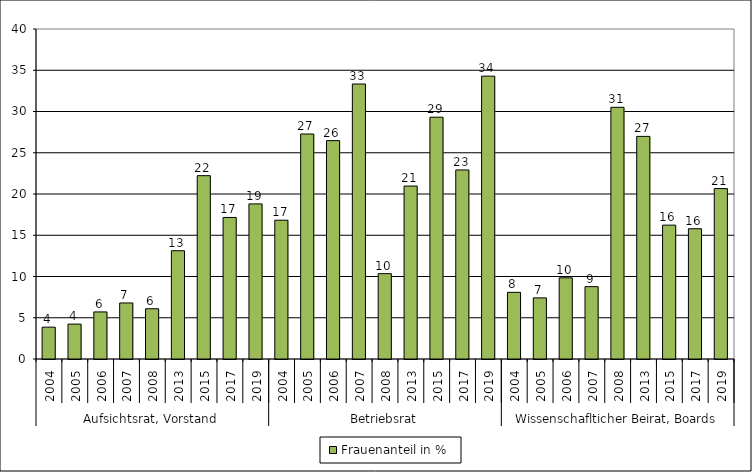
| Category | Frauenanteil in % |
|---|---|
| 0 | 3.86 |
| 1 | 4.23 |
| 2 | 5.705 |
| 3 | 6.792 |
| 4 | 6.091 |
| 5 | 13.122 |
| 6 | 22.222 |
| 7 | 17.157 |
| 8 | 18.8 |
| 9 | 16.822 |
| 10 | 27.273 |
| 11 | 26.471 |
| 12 | 33.333 |
| 13 | 10.345 |
| 14 | 20.961 |
| 15 | 29.31 |
| 16 | 22.917 |
| 17 | 34.286 |
| 18 | 8.081 |
| 19 | 7.407 |
| 20 | 9.839 |
| 21 | 8.769 |
| 22 | 30.508 |
| 23 | 26.984 |
| 24 | 16.225 |
| 25 | 15.789 |
| 26 | 20.656 |